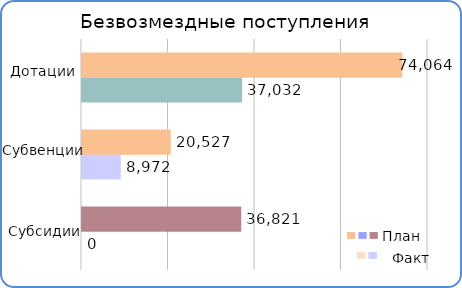
| Category | Факт | План  |
|---|---|---|
| Субсидии | 0 | 36820800 |
| Субвенции | 8972000 | 20526600 |
| Дотации | 37032000 | 74063900 |